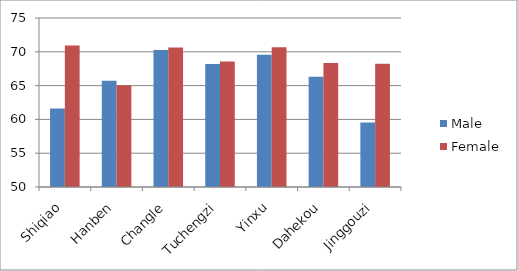
| Category | Male | Female |
|---|---|---|
| Shiqiao | 61.61 | 70.95 |
| Hanben | 65.71 | 65.06 |
| Changle | 70.25 | 70.64 |
| Tuchengzi | 68.2 | 68.56 |
| Yinxu | 69.58 | 70.69 |
| Dahekou | 66.31 | 68.34 |
| Jinggouzi | 59.54 | 68.23 |